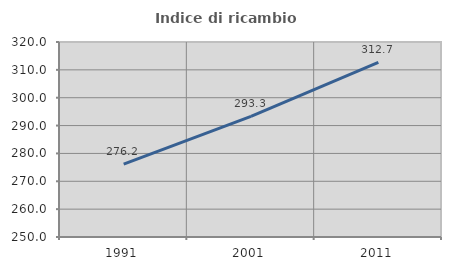
| Category | Indice di ricambio occupazionale  |
|---|---|
| 1991.0 | 276.19 |
| 2001.0 | 293.333 |
| 2011.0 | 312.727 |